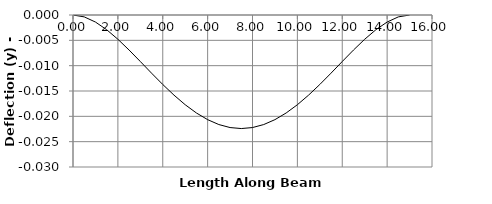
| Category | y |
|---|---|
| 0.0 | 0 |
| 0.0 | 0 |
| 0.5 | 0 |
| 1.0 | -0.001 |
| 1.5 | -0.003 |
| 2.0 | -0.005 |
| 2.5 | -0.007 |
| 3.0 | -0.009 |
| 3.5 | -0.011 |
| 4.0 | -0.014 |
| 4.5 | -0.016 |
| 5.0 | -0.018 |
| 5.5 | -0.019 |
| 6.0 | -0.021 |
| 6.5 | -0.022 |
| 7.0 | -0.022 |
| 7.5 | -0.022 |
| 7.5 | -0.022 |
| 7.5 | -0.022 |
| 8.0 | -0.022 |
| 8.5 | -0.022 |
| 9.0 | -0.021 |
| 9.5 | -0.019 |
| 10.0 | -0.018 |
| 10.5 | -0.016 |
| 11.0 | -0.014 |
| 11.5 | -0.011 |
| 12.0 | -0.009 |
| 12.5 | -0.007 |
| 13.0 | -0.005 |
| 13.5 | -0.003 |
| 14.0 | -0.001 |
| 14.5 | 0 |
| 15.0 | 0 |